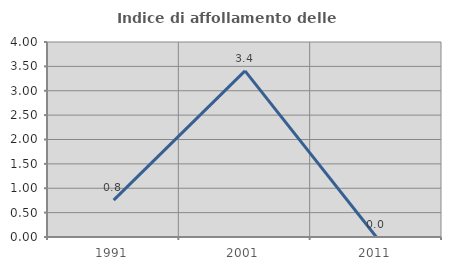
| Category | Indice di affollamento delle abitazioni  |
|---|---|
| 1991.0 | 0.758 |
| 2001.0 | 3.409 |
| 2011.0 | 0 |